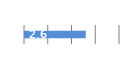
| Category | Series 0 |
|---|---|
| 0 | 2.6 |